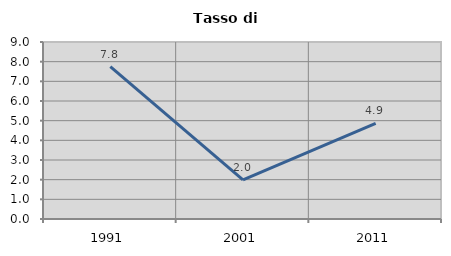
| Category | Tasso di disoccupazione   |
|---|---|
| 1991.0 | 7.751 |
| 2001.0 | 1.993 |
| 2011.0 | 4.865 |